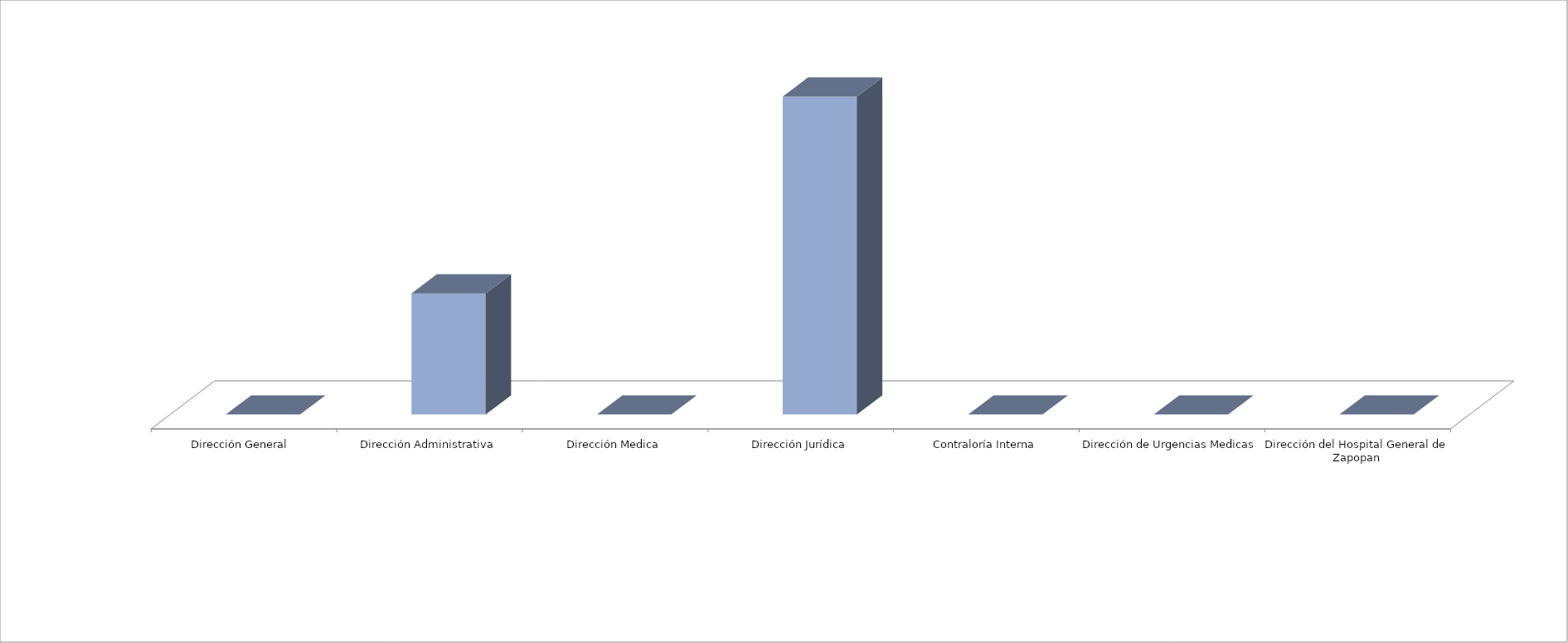
| Category | Series 0 | Series 1 |
|---|---|---|
| Dirección General  |  | 0 |
| Dirección Administrativa |  | 8 |
| Dirección Medica |  | 0 |
| Dirección Jurídica |  | 21 |
| Contraloría Interna |  | 0 |
| Dirección de Urgencias Medicas |  | 0 |
| Dirección del Hospital General de Zapopan |  | 0 |